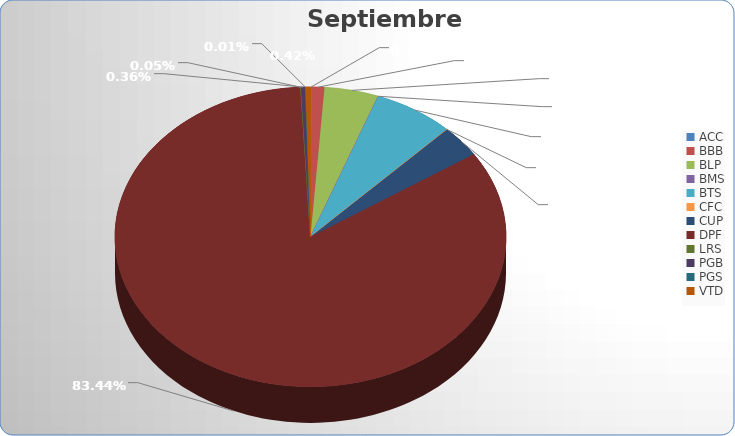
| Category | Septiembre 2022 |
|---|---|
| ACC | 1525206 |
| BBB | 14540053.03 |
| BLP | 63170974.97 |
| BMS | 5058.42 |
| BTS | 93702121.17 |
| CFC | 71698.54 |
| CUP | 48317126.51 |
| DPF | 1174638311.61 |
| LRS | 738752.57 |
| PGB | 5031895.8 |
| PGS | 147919.29 |
| VTD | 5891949.72 |